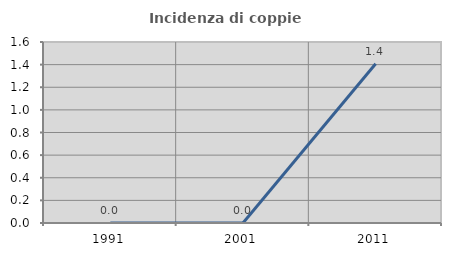
| Category | Incidenza di coppie miste |
|---|---|
| 1991.0 | 0 |
| 2001.0 | 0 |
| 2011.0 | 1.408 |